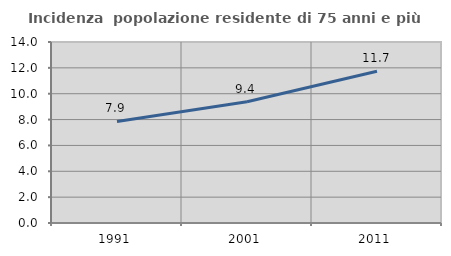
| Category | Incidenza  popolazione residente di 75 anni e più |
|---|---|
| 1991.0 | 7.855 |
| 2001.0 | 9.372 |
| 2011.0 | 11.739 |